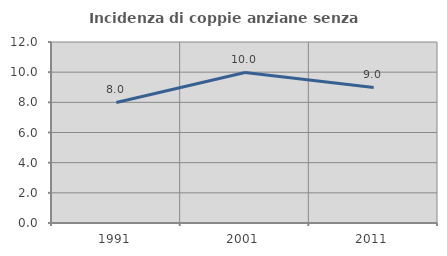
| Category | Incidenza di coppie anziane senza figli  |
|---|---|
| 1991.0 | 7.991 |
| 2001.0 | 9.98 |
| 2011.0 | 8.986 |